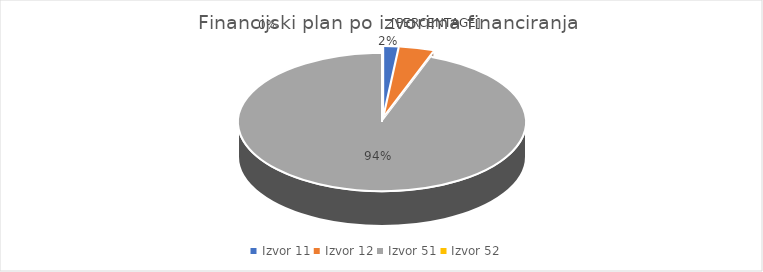
| Category | Iznos | Udio u ukupnom proračunu u % |
|---|---|---|
| Izvor 11 | 5987070 | 0.017 |
| Izvor 12 | 13820781 | 0.039 |
| Izvor 51 | 335014304 | 0.944 |
| Izvor 52 | 12000 | 0 |